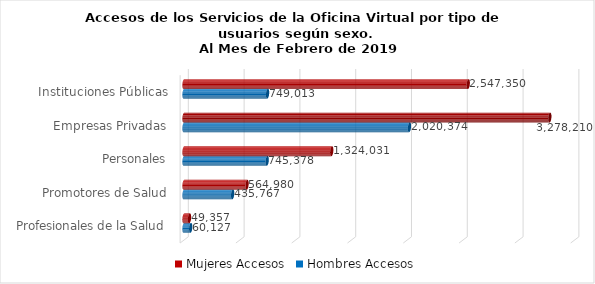
| Category | Mujeres | Hombres |
|---|---|---|
| Instituciones Públicas | 2547350 | 749013 |
| Empresas Privadas | 3278210 | 2020374 |
| Personales | 1324031 | 745378 |
| Promotores de Salud | 564980 | 435767 |
| Profesionales de la Salud | 49357 | 60127 |